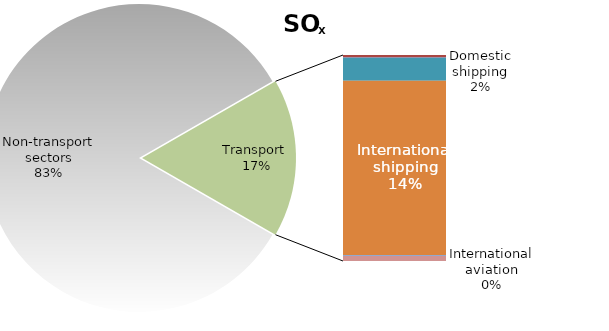
| Category | Series 0 |
|---|---|
| Non-transport sectors | 6067.376 |
| Road transport exhaust | 13.242 |
| Road transport non-exhaust | 0 |
| Railways | 3.176 |
| Domestic shipping | 134.128 |
| International shipping | 1022.583 |
| Domestic aviation | 6.362 |
| International aviation | 28.895 |